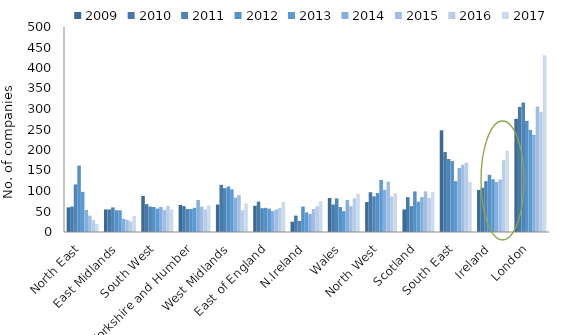
| Category | 2009 | 2010 | 2011 | 2012 | 2013 | 2014 | 2015 | 2016 | 2017 |
|---|---|---|---|---|---|---|---|---|---|
| North East | 60 | 62 | 116 | 162 | 98 | 54 | 40 | 29 | 20 |
| East Midlands | 55 | 55 | 60 | 53 | 53 | 32 | 30 | 26 | 39 |
| South West | 88 | 68 | 62 | 61 | 57 | 61 | 54 | 64 | 55 |
| Yorkshire and Humber | 66 | 63 | 56 | 56 | 59 | 78 | 62 | 55 | 65 |
| West Midlands | 67 | 115 | 107 | 111 | 104 | 84 | 90 | 53 | 70 |
| East of England | 64 | 74 | 58 | 59 | 57 | 51 | 55 | 59 | 73 |
| N.Ireland | 25 | 40 | 27 | 62 | 48 | 44 | 56 | 63 | 75 |
| Wales | 83 | 67 | 82 | 61 | 51 | 78 | 63 | 82 | 93 |
| North West | 73 | 97 | 87 | 95 | 127 | 103 | 123 | 87 | 95 |
| Scotland | 55 | 85 | 63 | 99 | 74 | 85 | 99 | 83 | 97 |
| South East | 248 | 195 | 178 | 173 | 124 | 156 | 164 | 169 | 122 |
| Ireland | 102.669 | 107.927 | 123.982 | 139.475 | 128.722 | 122 | 128 | 175 | 198 |
| London | 276 | 305 | 316 | 271 | 249 | 237 | 306 | 293 | 431 |